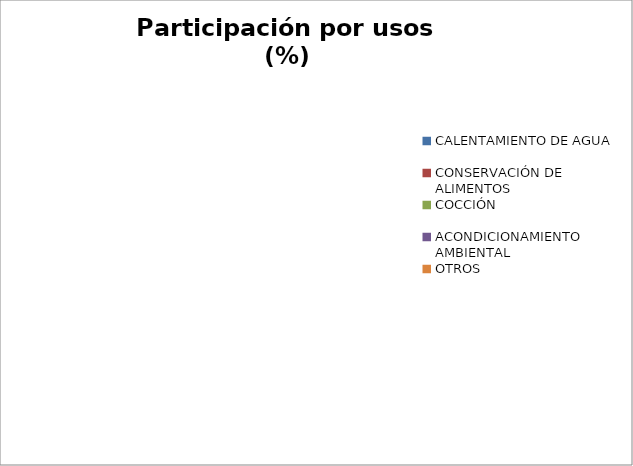
| Category | Series 0 |
|---|---|
| CALENTAMIENTO DE AGUA | 0 |
| CONSERVACIÓN DE ALIMENTOS | 0 |
| COCCIÓN | 0 |
| ACONDICIONAMIENTO AMBIENTAL | 0 |
| ILUMINACIÓN | 0 |
| OTROS | 0 |